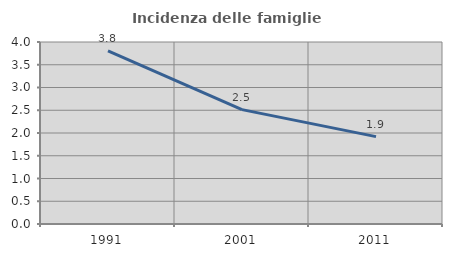
| Category | Incidenza delle famiglie numerose |
|---|---|
| 1991.0 | 3.807 |
| 2001.0 | 2.513 |
| 2011.0 | 1.921 |